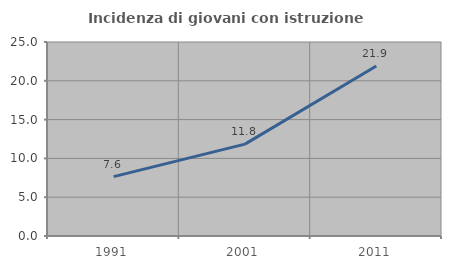
| Category | Incidenza di giovani con istruzione universitaria |
|---|---|
| 1991.0 | 7.647 |
| 2001.0 | 11.837 |
| 2011.0 | 21.918 |